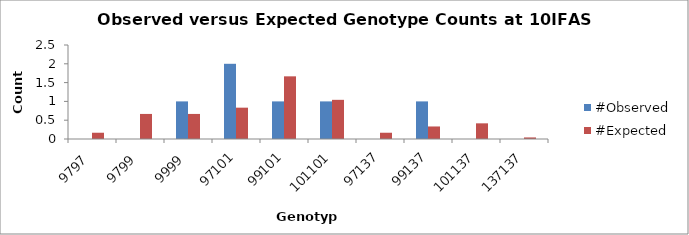
| Category | #Observed | #Expected |
|---|---|---|
| 9797.0 | 0 | 0.167 |
| 9799.0 | 0 | 0.667 |
| 9999.0 | 1 | 0.667 |
| 97101.0 | 2 | 0.833 |
| 99101.0 | 1 | 1.667 |
| 101101.0 | 1 | 1.042 |
| 97137.0 | 0 | 0.167 |
| 99137.0 | 1 | 0.333 |
| 101137.0 | 0 | 0.417 |
| 137137.0 | 0 | 0.042 |